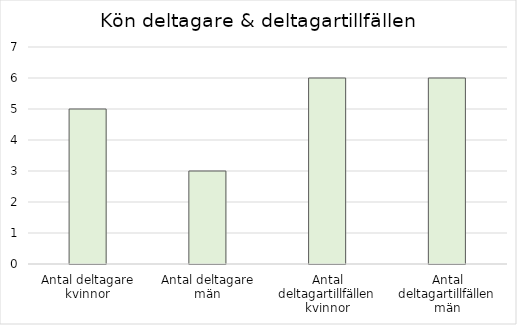
| Category | Series 0 |
|---|---|
| Antal deltagare kvinnor | 5 |
| Antal deltagare män | 3 |
| Antal deltagartillfällen kvinnor | 6 |
| Antal deltagartillfällen män | 6 |